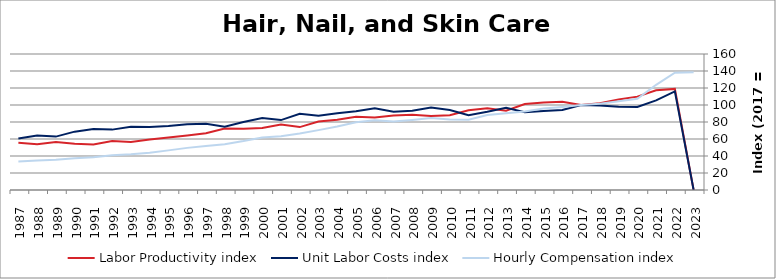
| Category | Labor Productivity index | Unit Labor Costs index | Hourly Compensation index |
|---|---|---|---|
| 2023.0 | 0 | 0 | 138.649 |
| 2022.0 | 118.905 | 116.007 | 137.939 |
| 2021.0 | 117.358 | 105.447 | 123.75 |
| 2020.0 | 109.834 | 97.68 | 107.286 |
| 2019.0 | 106.415 | 98.045 | 104.335 |
| 2018.0 | 102.163 | 99.279 | 101.426 |
| 2017.0 | 100 | 100 | 100 |
| 2016.0 | 103.76 | 94.175 | 97.716 |
| 2015.0 | 102.954 | 93.042 | 95.791 |
| 2014.0 | 101.182 | 91.377 | 92.457 |
| 2013.0 | 93.194 | 96.842 | 90.251 |
| 2012.0 | 96.083 | 91.94 | 88.339 |
| 2011.0 | 93.93 | 88.081 | 82.734 |
| 2010.0 | 88.001 | 94.115 | 82.822 |
| 2009.0 | 87.151 | 97.079 | 84.605 |
| 2008.0 | 88.456 | 93.151 | 82.397 |
| 2007.0 | 87.615 | 91.956 | 80.567 |
| 2006.0 | 85.397 | 96.059 | 82.031 |
| 2005.0 | 86.208 | 92.586 | 79.817 |
| 2004.0 | 82.758 | 90.223 | 74.667 |
| 2003.0 | 80.607 | 87.375 | 70.43 |
| 2002.0 | 73.997 | 89.706 | 66.38 |
| 2001.0 | 77.024 | 82.257 | 63.358 |
| 2000.0 | 72.984 | 84.742 | 61.848 |
| 1999.0 | 72.047 | 79.89 | 57.558 |
| 1998.0 | 72.317 | 74.538 | 53.904 |
| 1997.0 | 66.657 | 77.862 | 51.901 |
| 1996.0 | 64.053 | 77.367 | 49.556 |
| 1995.0 | 61.866 | 75.36 | 46.622 |
| 1994.0 | 59.324 | 74.084 | 43.95 |
| 1993.0 | 56.55 | 74.395 | 42.071 |
| 1992.0 | 57.69 | 71.039 | 40.982 |
| 1991.0 | 53.606 | 71.866 | 38.525 |
| 1990.0 | 54.44 | 68.661 | 37.379 |
| 1989.0 | 56.535 | 62.82 | 35.515 |
| 1988.0 | 53.921 | 64.111 | 34.569 |
| 1987.0 | 55.577 | 60.568 | 33.662 |